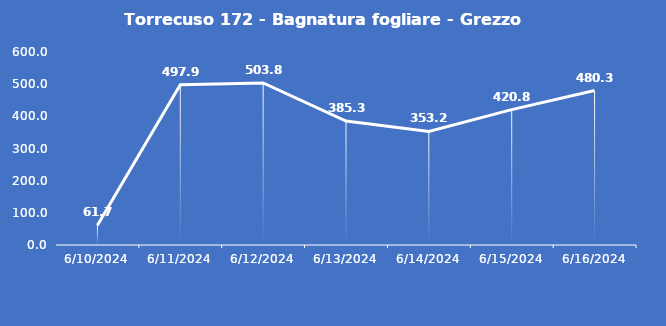
| Category | Torrecuso 172 - Bagnatura fogliare - Grezzo (min) |
|---|---|
| 6/10/24 | 61.7 |
| 6/11/24 | 497.9 |
| 6/12/24 | 503.8 |
| 6/13/24 | 385.3 |
| 6/14/24 | 353.2 |
| 6/15/24 | 420.8 |
| 6/16/24 | 480.3 |